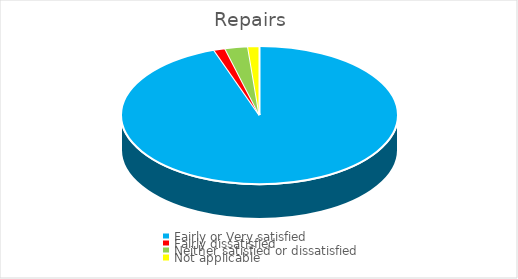
| Category | Series 0 |
|---|---|
| Fairly or Very satisfied | 94.67 |
| Fairly dissatisfied | 1.33 |
| Neither satisfied or dissatisfied | 2.67 |
| Not applicable | 1.33 |